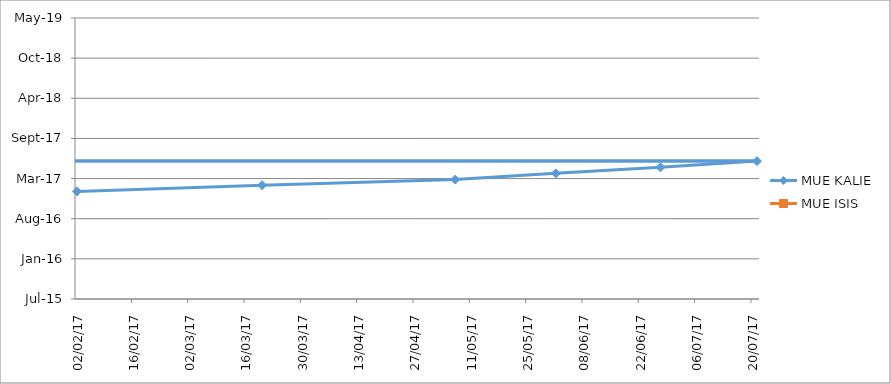
| Category | MUE KALIE | MUE ISIS |
|---|---|---|
| 2017-02-02 | 2017-01-01 |  |
| 2017-03-20 | 2017-02-01 |  |
| 2017-05-07 | 2017-03-01 |  |
| 2017-06-01 | 2017-04-01 |  |
| 2017-06-27 | 2017-05-01 |  |
| 2017-07-21 | 2017-06-01 |  |
| nan | 2017-07-01 |  |